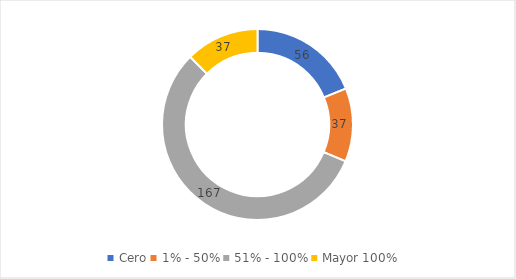
| Category | CANTIDAD |
|---|---|
| Cero | 56 |
| 1% - 50% | 37 |
| 51% - 100% | 167 |
| Mayor 100% | 37 |